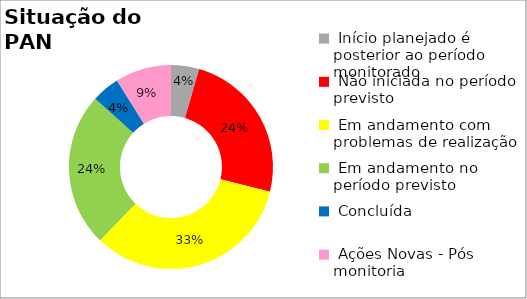
| Category | Series 0 |
|---|---|
|  Início planejado é posterior ao período monitorado | 0.044 |
|  Não iniciada no período previsto | 0.244 |
|  Em andamento com problemas de realização | 0.333 |
|  Em andamento no período previsto  | 0.244 |
|  Concluída | 0.044 |
|  Ações Novas - Pós monitoria | 0.089 |